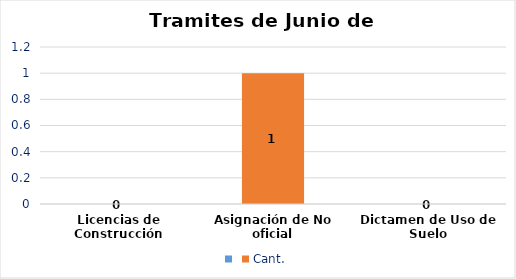
| Category | Series 0 | Cant. |
|---|---|---|
| Licencias de Construcción |  | 0 |
| Asignación de No oficial |  | 1 |
| Dictamen de Uso de Suelo |  | 0 |